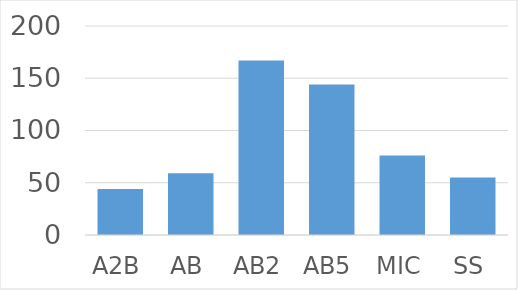
| Category | Total |
|---|---|
| A2B | 44 |
| AB | 59 |
| AB2 | 167 |
| AB5 | 144 |
| MIC | 76 |
| SS | 55 |